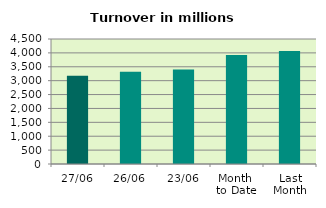
| Category | Series 0 |
|---|---|
| 27/06 | 3176.173 |
| 26/06 | 3316.531 |
| 23/06 | 3405.424 |
| Month 
to Date | 3926.642 |
| Last
Month | 4067.502 |